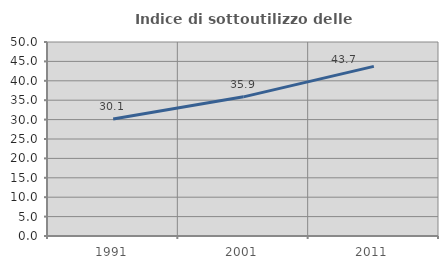
| Category | Indice di sottoutilizzo delle abitazioni  |
|---|---|
| 1991.0 | 30.149 |
| 2001.0 | 35.865 |
| 2011.0 | 43.721 |